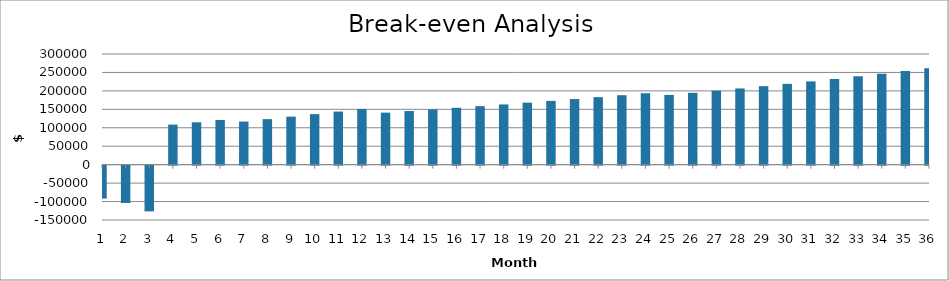
| Category | Net Income |
|---|---|
| 1.0 | -89241.286 |
| 2.0 | -101116.286 |
| 3.0 | -123893.236 |
| 4.0 | 108601.392 |
| 5.0 | 114857.323 |
| 6.0 | 121219.127 |
| 7.0 | 116873.479 |
| 8.0 | 123457.227 |
| 9.0 | 130157.402 |
| 10.0 | 136977.893 |
| 11.0 | 143922.794 |
| 12.0 | 150996.416 |
| 13.0 | 141097.8 |
| 14.0 | 145337.022 |
| 15.0 | 149671.767 |
| 16.0 | 154105.747 |
| 17.0 | 158642.88 |
| 18.0 | 163287.291 |
| 19.0 | 168043.334 |
| 20.0 | 172915.599 |
| 21.0 | 177908.931 |
| 22.0 | 183028.444 |
| 23.0 | 188279.538 |
| 24.0 | 193667.912 |
| 25.0 | 189103.955 |
| 26.0 | 194785.301 |
| 27.0 | 200623.039 |
| 28.0 | 206624.28 |
| 29.0 | 212796.541 |
| 30.0 | 219147.772 |
| 31.0 | 225686.382 |
| 32.0 | 232421.271 |
| 33.0 | 239361.854 |
| 34.0 | 246518.098 |
| 35.0 | 253900.554 |
| 36.0 | 261520.396 |